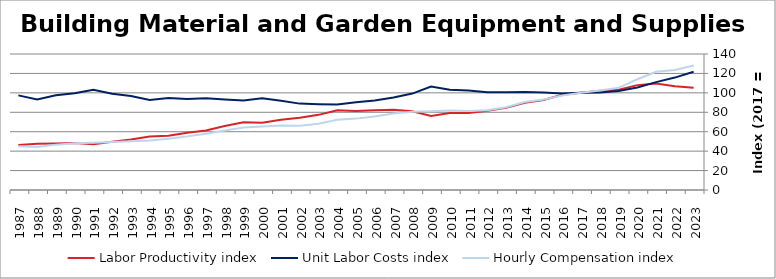
| Category | Labor Productivity index | Unit Labor Costs index | Hourly Compensation index |
|---|---|---|---|
| 2023.0 | 105.332 | 121.714 | 128.204 |
| 2022.0 | 106.802 | 115.72 | 123.591 |
| 2021.0 | 109.585 | 111.026 | 121.667 |
| 2020.0 | 107.97 | 105.602 | 114.018 |
| 2019.0 | 103.141 | 101.949 | 105.151 |
| 2018.0 | 102.167 | 100.262 | 102.435 |
| 2017.0 | 100 | 100 | 100 |
| 2016.0 | 98.128 | 99.214 | 97.357 |
| 2015.0 | 92.692 | 100.379 | 93.044 |
| 2014.0 | 89.719 | 100.864 | 90.495 |
| 2013.0 | 84.685 | 100.506 | 85.114 |
| 2012.0 | 81.459 | 100.711 | 82.038 |
| 2011.0 | 79.332 | 102.548 | 81.353 |
| 2010.0 | 79.379 | 103.181 | 81.904 |
| 2009.0 | 76.16 | 106.511 | 81.118 |
| 2008.0 | 81.086 | 99.24 | 80.469 |
| 2007.0 | 82.622 | 95.238 | 78.688 |
| 2006.0 | 82.21 | 92.067 | 75.688 |
| 2005.0 | 81.359 | 90.315 | 73.48 |
| 2004.0 | 82.025 | 88.017 | 72.196 |
| 2003.0 | 77.353 | 88.292 | 68.296 |
| 2002.0 | 74.285 | 88.927 | 66.06 |
| 2001.0 | 72.307 | 91.971 | 66.501 |
| 2000.0 | 69.154 | 94.551 | 65.386 |
| 1999.0 | 69.827 | 92.088 | 64.302 |
| 1998.0 | 65.807 | 93.177 | 61.317 |
| 1997.0 | 61.217 | 94.426 | 57.804 |
| 1996.0 | 58.878 | 93.754 | 55.2 |
| 1995.0 | 55.809 | 94.603 | 52.797 |
| 1994.0 | 55.04 | 92.614 | 50.975 |
| 1993.0 | 51.872 | 96.731 | 50.176 |
| 1992.0 | 49.766 | 99.195 | 49.365 |
| 1991.0 | 47.179 | 103.277 | 48.725 |
| 1990.0 | 48.379 | 99.622 | 48.196 |
| 1989.0 | 47.872 | 97.561 | 46.704 |
| 1988.0 | 47.566 | 93.19 | 44.327 |
| 1987.0 | 46.237 | 97.385 | 45.028 |